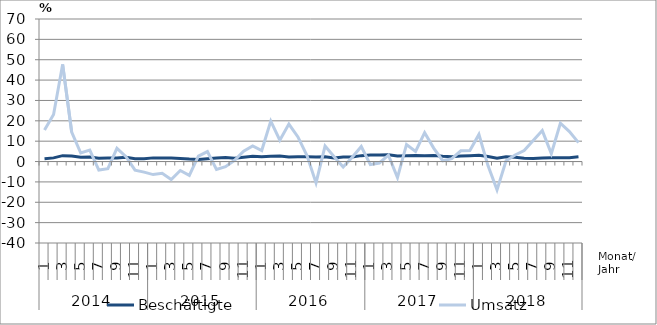
| Category | Beschäftigte | Umsatz |
|---|---|---|
| 0 | 1.4 | 15.5 |
| 1 | 1.8 | 23.1 |
| 2 | 2.9 | 47.7 |
| 3 | 2.7 | 14.5 |
| 4 | 2.1 | 4.2 |
| 5 | 2.2 | 5.6 |
| 6 | 1.6 | -4.2 |
| 7 | 1.7 | -3.5 |
| 8 | 1.7 | 6.5 |
| 9 | 2.1 | 2.4 |
| 10 | 1.4 | -4.2 |
| 11 | 1.4 | -5.2 |
| 12 | 1.8 | -6.4 |
| 13 | 1.8 | -5.8 |
| 14 | 1.7 | -8.8 |
| 15 | 1.5 | -4.4 |
| 16 | 1.2 | -6.8 |
| 17 | 1 | 2.7 |
| 18 | 1.4 | 4.9 |
| 19 | 1.7 | -3.9 |
| 20 | 2 | -2.5 |
| 21 | 1.6 | 0.6 |
| 22 | 2.1 | 5.1 |
| 23 | 2.6 | 7.7 |
| 24 | 2.4 | 5.4 |
| 25 | 2.6 | 19.9 |
| 26 | 2.7 | 10.5 |
| 27 | 2.2 | 18.4 |
| 28 | 2.3 | 12.1 |
| 29 | 2.3 | 2.9 |
| 30 | 2.2 | -10.5 |
| 31 | 2.4 | 7.6 |
| 32 | 1.8 | 2.4 |
| 33 | 2.2 | -2.7 |
| 34 | 2.2 | 2.1 |
| 35 | 2.9 | 7.4 |
| 36 | 3.2 | -1.5 |
| 37 | 3.2 | -0.7 |
| 38 | 3.3 | 3.1 |
| 39 | 2.7 | -7.9 |
| 40 | 2.9 | 8.4 |
| 41 | 3 | 5 |
| 42 | 2.8 | 14.2 |
| 43 | 3 | 6.6 |
| 44 | 2.6 | 0.4 |
| 45 | 2.3 | 1.4 |
| 46 | 2.7 | 5.3 |
| 47 | 2.9 | 5.4 |
| 48 | 3.1 | 13.3 |
| 49 | 2.5 | -2 |
| 50 | 1.6 | -13.9 |
| 51 | 2.4 | 0.4 |
| 52 | 2.1 | 3.2 |
| 53 | 1.6 | 5.4 |
| 54 | 1.5 | 10.3 |
| 55 | 1.7 | 15.2 |
| 56 | 1.9 | 3.9 |
| 57 | 1.9 | 18.8 |
| 58 | 1.9 | 14.7 |
| 59 | 2.4 | 9.3 |